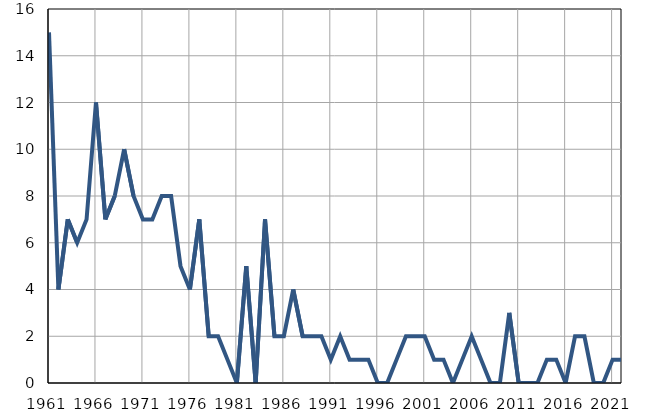
| Category | Умрла 
одојчад |
|---|---|
| 1961.0 | 15 |
| 1962.0 | 4 |
| 1963.0 | 7 |
| 1964.0 | 6 |
| 1965.0 | 7 |
| 1966.0 | 12 |
| 1967.0 | 7 |
| 1968.0 | 8 |
| 1969.0 | 10 |
| 1970.0 | 8 |
| 1971.0 | 7 |
| 1972.0 | 7 |
| 1973.0 | 8 |
| 1974.0 | 8 |
| 1975.0 | 5 |
| 1976.0 | 4 |
| 1977.0 | 7 |
| 1978.0 | 2 |
| 1979.0 | 2 |
| 1980.0 | 1 |
| 1981.0 | 0 |
| 1982.0 | 5 |
| 1983.0 | 0 |
| 1984.0 | 7 |
| 1985.0 | 2 |
| 1986.0 | 2 |
| 1987.0 | 4 |
| 1988.0 | 2 |
| 1989.0 | 2 |
| 1990.0 | 2 |
| 1991.0 | 1 |
| 1992.0 | 2 |
| 1993.0 | 1 |
| 1994.0 | 1 |
| 1995.0 | 1 |
| 1996.0 | 0 |
| 1997.0 | 0 |
| 1998.0 | 1 |
| 1999.0 | 2 |
| 2000.0 | 2 |
| 2001.0 | 2 |
| 2002.0 | 1 |
| 2003.0 | 1 |
| 2004.0 | 0 |
| 2005.0 | 1 |
| 2006.0 | 2 |
| 2007.0 | 1 |
| 2008.0 | 0 |
| 2009.0 | 0 |
| 2010.0 | 3 |
| 2011.0 | 0 |
| 2012.0 | 0 |
| 2013.0 | 0 |
| 2014.0 | 1 |
| 2015.0 | 1 |
| 2016.0 | 0 |
| 2017.0 | 2 |
| 2018.0 | 2 |
| 2019.0 | 0 |
| 2020.0 | 0 |
| 2021.0 | 1 |
| 2022.0 | 1 |